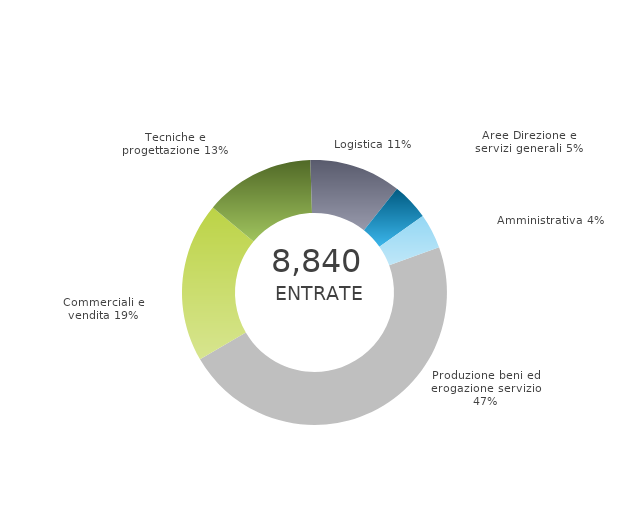
| Category | Series 0 | Series 1 |
|---|---|---|
| Produzione beni ed erogazione servizio | 0 | 0.472 |
| Commerciali e vendita | 0 | 0.195 |
| Tecniche e progettazione | 0 | 0.134 |
| Logistica | 0 | 0.112 |
| Aree Direzione e servizi generali | 0 | 0.045 |
| Amministrativa | 0 | 0.042 |